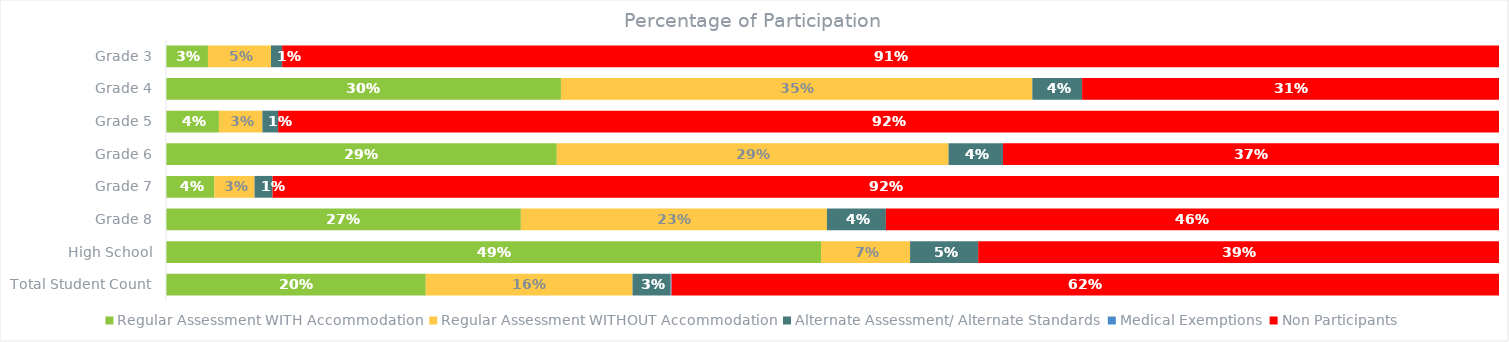
| Category | Regular Assessment WITH Accommodation | Regular Assessment WITHOUT Accommodation | Alternate Assessment/ Alternate Standards | Medical Exemptions | Non Participants |
|---|---|---|---|---|---|
| Grade 3 | 0.031 | 0.047 | 0.008 | 0 | 0.913 |
| Grade 4 | 0.296 | 0.354 | 0.037 | 0 | 0.313 |
| Grade 5 | 0.04 | 0.033 | 0.012 | 0 | 0.916 |
| Grade 6 | 0.293 | 0.294 | 0.041 | 0 | 0.372 |
| Grade 7 | 0.036 | 0.03 | 0.014 | 0 | 0.92 |
| Grade 8 | 0.266 | 0.23 | 0.044 | 0 | 0.46 |
| High School | 0.491 | 0.067 | 0.051 | 0 | 0.391 |
| Total Student Count | 0.195 | 0.155 | 0.029 | 0.001 | 0.621 |